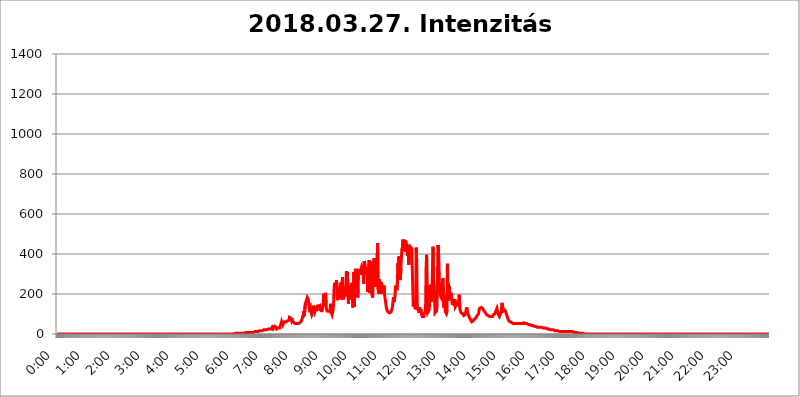
| Category | 2018.03.27. Intenzitás [W/m^2] |
|---|---|
| 0.0 | 0 |
| 0.0006944444444444445 | 0 |
| 0.001388888888888889 | 0 |
| 0.0020833333333333333 | 0 |
| 0.002777777777777778 | 0 |
| 0.003472222222222222 | 0 |
| 0.004166666666666667 | 0 |
| 0.004861111111111111 | 0 |
| 0.005555555555555556 | 0 |
| 0.0062499999999999995 | 0 |
| 0.006944444444444444 | 0 |
| 0.007638888888888889 | 0 |
| 0.008333333333333333 | 0 |
| 0.009027777777777779 | 0 |
| 0.009722222222222222 | 0 |
| 0.010416666666666666 | 0 |
| 0.011111111111111112 | 0 |
| 0.011805555555555555 | 0 |
| 0.012499999999999999 | 0 |
| 0.013194444444444444 | 0 |
| 0.013888888888888888 | 0 |
| 0.014583333333333332 | 0 |
| 0.015277777777777777 | 0 |
| 0.015972222222222224 | 0 |
| 0.016666666666666666 | 0 |
| 0.017361111111111112 | 0 |
| 0.018055555555555557 | 0 |
| 0.01875 | 0 |
| 0.019444444444444445 | 0 |
| 0.02013888888888889 | 0 |
| 0.020833333333333332 | 0 |
| 0.02152777777777778 | 0 |
| 0.022222222222222223 | 0 |
| 0.02291666666666667 | 0 |
| 0.02361111111111111 | 0 |
| 0.024305555555555556 | 0 |
| 0.024999999999999998 | 0 |
| 0.025694444444444447 | 0 |
| 0.02638888888888889 | 0 |
| 0.027083333333333334 | 0 |
| 0.027777777777777776 | 0 |
| 0.02847222222222222 | 0 |
| 0.029166666666666664 | 0 |
| 0.029861111111111113 | 0 |
| 0.030555555555555555 | 0 |
| 0.03125 | 0 |
| 0.03194444444444445 | 0 |
| 0.03263888888888889 | 0 |
| 0.03333333333333333 | 0 |
| 0.034027777777777775 | 0 |
| 0.034722222222222224 | 0 |
| 0.035416666666666666 | 0 |
| 0.036111111111111115 | 0 |
| 0.03680555555555556 | 0 |
| 0.0375 | 0 |
| 0.03819444444444444 | 0 |
| 0.03888888888888889 | 0 |
| 0.03958333333333333 | 0 |
| 0.04027777777777778 | 0 |
| 0.04097222222222222 | 0 |
| 0.041666666666666664 | 0 |
| 0.042361111111111106 | 0 |
| 0.04305555555555556 | 0 |
| 0.043750000000000004 | 0 |
| 0.044444444444444446 | 0 |
| 0.04513888888888889 | 0 |
| 0.04583333333333334 | 0 |
| 0.04652777777777778 | 0 |
| 0.04722222222222222 | 0 |
| 0.04791666666666666 | 0 |
| 0.04861111111111111 | 0 |
| 0.049305555555555554 | 0 |
| 0.049999999999999996 | 0 |
| 0.05069444444444445 | 0 |
| 0.051388888888888894 | 0 |
| 0.052083333333333336 | 0 |
| 0.05277777777777778 | 0 |
| 0.05347222222222222 | 0 |
| 0.05416666666666667 | 0 |
| 0.05486111111111111 | 0 |
| 0.05555555555555555 | 0 |
| 0.05625 | 0 |
| 0.05694444444444444 | 0 |
| 0.057638888888888885 | 0 |
| 0.05833333333333333 | 0 |
| 0.05902777777777778 | 0 |
| 0.059722222222222225 | 0 |
| 0.06041666666666667 | 0 |
| 0.061111111111111116 | 0 |
| 0.06180555555555556 | 0 |
| 0.0625 | 0 |
| 0.06319444444444444 | 0 |
| 0.06388888888888888 | 0 |
| 0.06458333333333334 | 0 |
| 0.06527777777777778 | 0 |
| 0.06597222222222222 | 0 |
| 0.06666666666666667 | 0 |
| 0.06736111111111111 | 0 |
| 0.06805555555555555 | 0 |
| 0.06874999999999999 | 0 |
| 0.06944444444444443 | 0 |
| 0.07013888888888889 | 0 |
| 0.07083333333333333 | 0 |
| 0.07152777777777779 | 0 |
| 0.07222222222222223 | 0 |
| 0.07291666666666667 | 0 |
| 0.07361111111111111 | 0 |
| 0.07430555555555556 | 0 |
| 0.075 | 0 |
| 0.07569444444444444 | 0 |
| 0.0763888888888889 | 0 |
| 0.07708333333333334 | 0 |
| 0.07777777777777778 | 0 |
| 0.07847222222222222 | 0 |
| 0.07916666666666666 | 0 |
| 0.0798611111111111 | 0 |
| 0.08055555555555556 | 0 |
| 0.08125 | 0 |
| 0.08194444444444444 | 0 |
| 0.08263888888888889 | 0 |
| 0.08333333333333333 | 0 |
| 0.08402777777777777 | 0 |
| 0.08472222222222221 | 0 |
| 0.08541666666666665 | 0 |
| 0.08611111111111112 | 0 |
| 0.08680555555555557 | 0 |
| 0.08750000000000001 | 0 |
| 0.08819444444444445 | 0 |
| 0.08888888888888889 | 0 |
| 0.08958333333333333 | 0 |
| 0.09027777777777778 | 0 |
| 0.09097222222222222 | 0 |
| 0.09166666666666667 | 0 |
| 0.09236111111111112 | 0 |
| 0.09305555555555556 | 0 |
| 0.09375 | 0 |
| 0.09444444444444444 | 0 |
| 0.09513888888888888 | 0 |
| 0.09583333333333333 | 0 |
| 0.09652777777777777 | 0 |
| 0.09722222222222222 | 0 |
| 0.09791666666666667 | 0 |
| 0.09861111111111111 | 0 |
| 0.09930555555555555 | 0 |
| 0.09999999999999999 | 0 |
| 0.10069444444444443 | 0 |
| 0.1013888888888889 | 0 |
| 0.10208333333333335 | 0 |
| 0.10277777777777779 | 0 |
| 0.10347222222222223 | 0 |
| 0.10416666666666667 | 0 |
| 0.10486111111111111 | 0 |
| 0.10555555555555556 | 0 |
| 0.10625 | 0 |
| 0.10694444444444444 | 0 |
| 0.1076388888888889 | 0 |
| 0.10833333333333334 | 0 |
| 0.10902777777777778 | 0 |
| 0.10972222222222222 | 0 |
| 0.1111111111111111 | 0 |
| 0.11180555555555556 | 0 |
| 0.11180555555555556 | 0 |
| 0.1125 | 0 |
| 0.11319444444444444 | 0 |
| 0.11388888888888889 | 0 |
| 0.11458333333333333 | 0 |
| 0.11527777777777777 | 0 |
| 0.11597222222222221 | 0 |
| 0.11666666666666665 | 0 |
| 0.1173611111111111 | 0 |
| 0.11805555555555557 | 0 |
| 0.11944444444444445 | 0 |
| 0.12013888888888889 | 0 |
| 0.12083333333333333 | 0 |
| 0.12152777777777778 | 0 |
| 0.12222222222222223 | 0 |
| 0.12291666666666667 | 0 |
| 0.12291666666666667 | 0 |
| 0.12361111111111112 | 0 |
| 0.12430555555555556 | 0 |
| 0.125 | 0 |
| 0.12569444444444444 | 0 |
| 0.12638888888888888 | 0 |
| 0.12708333333333333 | 0 |
| 0.16875 | 0 |
| 0.12847222222222224 | 0 |
| 0.12916666666666668 | 0 |
| 0.12986111111111112 | 0 |
| 0.13055555555555556 | 0 |
| 0.13125 | 0 |
| 0.13194444444444445 | 0 |
| 0.1326388888888889 | 0 |
| 0.13333333333333333 | 0 |
| 0.13402777777777777 | 0 |
| 0.13402777777777777 | 0 |
| 0.13472222222222222 | 0 |
| 0.13541666666666666 | 0 |
| 0.1361111111111111 | 0 |
| 0.13749999999999998 | 0 |
| 0.13819444444444443 | 0 |
| 0.1388888888888889 | 0 |
| 0.13958333333333334 | 0 |
| 0.14027777777777778 | 0 |
| 0.14097222222222222 | 0 |
| 0.14166666666666666 | 0 |
| 0.1423611111111111 | 0 |
| 0.14305555555555557 | 0 |
| 0.14375000000000002 | 0 |
| 0.14444444444444446 | 0 |
| 0.1451388888888889 | 0 |
| 0.1451388888888889 | 0 |
| 0.14652777777777778 | 0 |
| 0.14722222222222223 | 0 |
| 0.14791666666666667 | 0 |
| 0.1486111111111111 | 0 |
| 0.14930555555555555 | 0 |
| 0.15 | 0 |
| 0.15069444444444444 | 0 |
| 0.15138888888888888 | 0 |
| 0.15208333333333332 | 0 |
| 0.15277777777777776 | 0 |
| 0.15347222222222223 | 0 |
| 0.15416666666666667 | 0 |
| 0.15486111111111112 | 0 |
| 0.15555555555555556 | 0 |
| 0.15625 | 0 |
| 0.15694444444444444 | 0 |
| 0.15763888888888888 | 0 |
| 0.15833333333333333 | 0 |
| 0.15902777777777777 | 0 |
| 0.15972222222222224 | 0 |
| 0.16041666666666668 | 0 |
| 0.16111111111111112 | 0 |
| 0.16180555555555556 | 0 |
| 0.1625 | 0 |
| 0.16319444444444445 | 0 |
| 0.1638888888888889 | 0 |
| 0.16458333333333333 | 0 |
| 0.16527777777777777 | 0 |
| 0.16597222222222222 | 0 |
| 0.16666666666666666 | 0 |
| 0.1673611111111111 | 0 |
| 0.16805555555555554 | 0 |
| 0.16874999999999998 | 0 |
| 0.16944444444444443 | 0 |
| 0.17013888888888887 | 0 |
| 0.1708333333333333 | 0 |
| 0.17152777777777775 | 0 |
| 0.17222222222222225 | 0 |
| 0.1729166666666667 | 0 |
| 0.17361111111111113 | 0 |
| 0.17430555555555557 | 0 |
| 0.17500000000000002 | 0 |
| 0.17569444444444446 | 0 |
| 0.1763888888888889 | 0 |
| 0.17708333333333334 | 0 |
| 0.17777777777777778 | 0 |
| 0.17847222222222223 | 0 |
| 0.17916666666666667 | 0 |
| 0.1798611111111111 | 0 |
| 0.18055555555555555 | 0 |
| 0.18125 | 0 |
| 0.18194444444444444 | 0 |
| 0.1826388888888889 | 0 |
| 0.18333333333333335 | 0 |
| 0.1840277777777778 | 0 |
| 0.18472222222222223 | 0 |
| 0.18541666666666667 | 0 |
| 0.18611111111111112 | 0 |
| 0.18680555555555556 | 0 |
| 0.1875 | 0 |
| 0.18819444444444444 | 0 |
| 0.18888888888888888 | 0 |
| 0.18958333333333333 | 0 |
| 0.19027777777777777 | 0 |
| 0.1909722222222222 | 0 |
| 0.19166666666666665 | 0 |
| 0.19236111111111112 | 0 |
| 0.19305555555555554 | 0 |
| 0.19375 | 0 |
| 0.19444444444444445 | 0 |
| 0.1951388888888889 | 0 |
| 0.19583333333333333 | 0 |
| 0.19652777777777777 | 0 |
| 0.19722222222222222 | 0 |
| 0.19791666666666666 | 0 |
| 0.1986111111111111 | 0 |
| 0.19930555555555554 | 0 |
| 0.19999999999999998 | 0 |
| 0.20069444444444443 | 0 |
| 0.20138888888888887 | 0 |
| 0.2020833333333333 | 0 |
| 0.2027777777777778 | 0 |
| 0.2034722222222222 | 0 |
| 0.2041666666666667 | 0 |
| 0.20486111111111113 | 0 |
| 0.20555555555555557 | 0 |
| 0.20625000000000002 | 0 |
| 0.20694444444444446 | 0 |
| 0.2076388888888889 | 0 |
| 0.20833333333333334 | 0 |
| 0.20902777777777778 | 0 |
| 0.20972222222222223 | 0 |
| 0.21041666666666667 | 0 |
| 0.2111111111111111 | 0 |
| 0.21180555555555555 | 0 |
| 0.2125 | 0 |
| 0.21319444444444444 | 0 |
| 0.2138888888888889 | 0 |
| 0.21458333333333335 | 0 |
| 0.2152777777777778 | 0 |
| 0.21597222222222223 | 0 |
| 0.21666666666666667 | 0 |
| 0.21736111111111112 | 0 |
| 0.21805555555555556 | 0 |
| 0.21875 | 0 |
| 0.21944444444444444 | 0 |
| 0.22013888888888888 | 0 |
| 0.22083333333333333 | 0 |
| 0.22152777777777777 | 0 |
| 0.2222222222222222 | 0 |
| 0.22291666666666665 | 0 |
| 0.2236111111111111 | 0 |
| 0.22430555555555556 | 0 |
| 0.225 | 0 |
| 0.22569444444444445 | 0 |
| 0.2263888888888889 | 0 |
| 0.22708333333333333 | 0 |
| 0.22777777777777777 | 0 |
| 0.22847222222222222 | 0 |
| 0.22916666666666666 | 0 |
| 0.2298611111111111 | 0 |
| 0.23055555555555554 | 0 |
| 0.23124999999999998 | 0 |
| 0.23194444444444443 | 0 |
| 0.23263888888888887 | 0 |
| 0.2333333333333333 | 0 |
| 0.2340277777777778 | 0 |
| 0.2347222222222222 | 0 |
| 0.2354166666666667 | 0 |
| 0.23611111111111113 | 0 |
| 0.23680555555555557 | 0 |
| 0.23750000000000002 | 0 |
| 0.23819444444444446 | 0 |
| 0.2388888888888889 | 0 |
| 0.23958333333333334 | 0 |
| 0.24027777777777778 | 0 |
| 0.24097222222222223 | 0 |
| 0.24166666666666667 | 0 |
| 0.2423611111111111 | 0 |
| 0.24305555555555555 | 0 |
| 0.24375 | 0 |
| 0.24444444444444446 | 0 |
| 0.24513888888888888 | 0 |
| 0.24583333333333335 | 0 |
| 0.2465277777777778 | 0 |
| 0.24722222222222223 | 3.525 |
| 0.24791666666666667 | 0 |
| 0.24861111111111112 | 3.525 |
| 0.24930555555555556 | 3.525 |
| 0.25 | 3.525 |
| 0.25069444444444444 | 3.525 |
| 0.2513888888888889 | 3.525 |
| 0.2520833333333333 | 3.525 |
| 0.25277777777777777 | 3.525 |
| 0.2534722222222222 | 3.525 |
| 0.25416666666666665 | 3.525 |
| 0.2548611111111111 | 3.525 |
| 0.2555555555555556 | 3.525 |
| 0.25625000000000003 | 3.525 |
| 0.2569444444444445 | 3.525 |
| 0.2576388888888889 | 3.525 |
| 0.25833333333333336 | 3.525 |
| 0.2590277777777778 | 3.525 |
| 0.25972222222222224 | 3.525 |
| 0.2604166666666667 | 3.525 |
| 0.2611111111111111 | 3.525 |
| 0.26180555555555557 | 3.525 |
| 0.2625 | 3.525 |
| 0.26319444444444445 | 3.525 |
| 0.2638888888888889 | 7.887 |
| 0.26458333333333334 | 7.887 |
| 0.2652777777777778 | 7.887 |
| 0.2659722222222222 | 7.887 |
| 0.26666666666666666 | 7.887 |
| 0.2673611111111111 | 7.887 |
| 0.26805555555555555 | 7.887 |
| 0.26875 | 7.887 |
| 0.26944444444444443 | 7.887 |
| 0.2701388888888889 | 7.887 |
| 0.2708333333333333 | 7.887 |
| 0.27152777777777776 | 7.887 |
| 0.2722222222222222 | 7.887 |
| 0.27291666666666664 | 7.887 |
| 0.2736111111111111 | 7.887 |
| 0.2743055555555555 | 12.257 |
| 0.27499999999999997 | 7.887 |
| 0.27569444444444446 | 12.257 |
| 0.27638888888888885 | 12.257 |
| 0.27708333333333335 | 12.257 |
| 0.2777777777777778 | 12.257 |
| 0.27847222222222223 | 12.257 |
| 0.2791666666666667 | 12.257 |
| 0.2798611111111111 | 12.257 |
| 0.28055555555555556 | 12.257 |
| 0.28125 | 12.257 |
| 0.28194444444444444 | 12.257 |
| 0.2826388888888889 | 16.636 |
| 0.2833333333333333 | 16.636 |
| 0.28402777777777777 | 16.636 |
| 0.2847222222222222 | 16.636 |
| 0.28541666666666665 | 16.636 |
| 0.28611111111111115 | 16.636 |
| 0.28680555555555554 | 16.636 |
| 0.28750000000000003 | 16.636 |
| 0.2881944444444445 | 21.024 |
| 0.2888888888888889 | 21.024 |
| 0.28958333333333336 | 21.024 |
| 0.2902777777777778 | 21.024 |
| 0.29097222222222224 | 21.024 |
| 0.2916666666666667 | 21.024 |
| 0.2923611111111111 | 21.024 |
| 0.29305555555555557 | 21.024 |
| 0.29375 | 21.024 |
| 0.29444444444444445 | 25.419 |
| 0.2951388888888889 | 25.419 |
| 0.29583333333333334 | 25.419 |
| 0.2965277777777778 | 25.419 |
| 0.2972222222222222 | 25.419 |
| 0.29791666666666666 | 25.419 |
| 0.2986111111111111 | 25.419 |
| 0.29930555555555555 | 25.419 |
| 0.3 | 25.419 |
| 0.30069444444444443 | 25.419 |
| 0.3013888888888889 | 34.234 |
| 0.3020833333333333 | 29.823 |
| 0.30277777777777776 | 25.419 |
| 0.3034722222222222 | 25.419 |
| 0.30416666666666664 | 25.419 |
| 0.3048611111111111 | 38.653 |
| 0.3055555555555555 | 34.234 |
| 0.30624999999999997 | 38.653 |
| 0.3069444444444444 | 34.234 |
| 0.3076388888888889 | 25.419 |
| 0.30833333333333335 | 25.419 |
| 0.3090277777777778 | 25.419 |
| 0.30972222222222223 | 29.823 |
| 0.3104166666666667 | 29.823 |
| 0.3111111111111111 | 29.823 |
| 0.31180555555555556 | 29.823 |
| 0.3125 | 34.234 |
| 0.31319444444444444 | 43.079 |
| 0.3138888888888889 | 47.511 |
| 0.3145833333333333 | 60.85 |
| 0.31527777777777777 | 51.951 |
| 0.3159722222222222 | 65.31 |
| 0.31666666666666665 | 47.511 |
| 0.31736111111111115 | 47.511 |
| 0.31805555555555554 | 47.511 |
| 0.31875000000000003 | 60.85 |
| 0.3194444444444445 | 65.31 |
| 0.3201388888888889 | 60.85 |
| 0.32083333333333336 | 60.85 |
| 0.3215277777777778 | 65.31 |
| 0.32222222222222224 | 60.85 |
| 0.3229166666666667 | 65.31 |
| 0.3236111111111111 | 69.775 |
| 0.32430555555555557 | 69.775 |
| 0.325 | 69.775 |
| 0.32569444444444445 | 83.205 |
| 0.3263888888888889 | 83.205 |
| 0.32708333333333334 | 87.692 |
| 0.3277777777777778 | 78.722 |
| 0.3284722222222222 | 69.775 |
| 0.32916666666666666 | 78.722 |
| 0.3298611111111111 | 65.31 |
| 0.33055555555555555 | 60.85 |
| 0.33125 | 60.85 |
| 0.33194444444444443 | 56.398 |
| 0.3326388888888889 | 56.398 |
| 0.3333333333333333 | 51.951 |
| 0.3340277777777778 | 51.951 |
| 0.3347222222222222 | 51.951 |
| 0.3354166666666667 | 51.951 |
| 0.3361111111111111 | 51.951 |
| 0.3368055555555556 | 51.951 |
| 0.33749999999999997 | 51.951 |
| 0.33819444444444446 | 51.951 |
| 0.33888888888888885 | 51.951 |
| 0.33958333333333335 | 51.951 |
| 0.34027777777777773 | 56.398 |
| 0.34097222222222223 | 56.398 |
| 0.3416666666666666 | 60.85 |
| 0.3423611111111111 | 65.31 |
| 0.3430555555555555 | 69.775 |
| 0.34375 | 78.722 |
| 0.3444444444444445 | 92.184 |
| 0.3451388888888889 | 83.205 |
| 0.3458333333333334 | 114.716 |
| 0.34652777777777777 | 92.184 |
| 0.34722222222222227 | 96.682 |
| 0.34791666666666665 | 150.964 |
| 0.34861111111111115 | 155.509 |
| 0.34930555555555554 | 146.423 |
| 0.35000000000000003 | 173.709 |
| 0.3506944444444444 | 182.82 |
| 0.3513888888888889 | 182.82 |
| 0.3520833333333333 | 173.709 |
| 0.3527777777777778 | 146.423 |
| 0.3534722222222222 | 128.284 |
| 0.3541666666666667 | 132.814 |
| 0.3548611111111111 | 137.347 |
| 0.35555555555555557 | 114.716 |
| 0.35625 | 114.716 |
| 0.35694444444444445 | 96.682 |
| 0.3576388888888889 | 96.682 |
| 0.35833333333333334 | 101.184 |
| 0.3590277777777778 | 119.235 |
| 0.3597222222222222 | 141.884 |
| 0.36041666666666666 | 119.235 |
| 0.3611111111111111 | 110.201 |
| 0.36180555555555555 | 119.235 |
| 0.3625 | 137.347 |
| 0.36319444444444443 | 114.716 |
| 0.3638888888888889 | 119.235 |
| 0.3645833333333333 | 128.284 |
| 0.3652777777777778 | 146.423 |
| 0.3659722222222222 | 137.347 |
| 0.3666666666666667 | 141.884 |
| 0.3673611111111111 | 141.884 |
| 0.3680555555555556 | 141.884 |
| 0.36874999999999997 | 114.716 |
| 0.36944444444444446 | 128.284 |
| 0.37013888888888885 | 119.235 |
| 0.37083333333333335 | 110.201 |
| 0.37152777777777773 | 110.201 |
| 0.37222222222222223 | 110.201 |
| 0.3729166666666666 | 146.423 |
| 0.3736111111111111 | 201.058 |
| 0.3743055555555555 | 164.605 |
| 0.375 | 141.884 |
| 0.3756944444444445 | 182.82 |
| 0.3763888888888889 | 205.62 |
| 0.3770833333333334 | 137.347 |
| 0.37777777777777777 | 123.758 |
| 0.37847222222222227 | 114.716 |
| 0.37916666666666665 | 110.201 |
| 0.37986111111111115 | 114.716 |
| 0.38055555555555554 | 114.716 |
| 0.38125000000000003 | 119.235 |
| 0.3819444444444444 | 114.716 |
| 0.3826388888888889 | 110.201 |
| 0.3833333333333333 | 150.964 |
| 0.3840277777777778 | 110.201 |
| 0.3847222222222222 | 105.69 |
| 0.3854166666666667 | 96.682 |
| 0.3861111111111111 | 101.184 |
| 0.38680555555555557 | 119.235 |
| 0.3875 | 146.423 |
| 0.38819444444444445 | 219.309 |
| 0.3888888888888889 | 255.813 |
| 0.38958333333333334 | 260.373 |
| 0.3902777777777778 | 233 |
| 0.3909722222222222 | 242.127 |
| 0.39166666666666666 | 269.49 |
| 0.3923611111111111 | 274.047 |
| 0.39305555555555555 | 169.156 |
| 0.39375 | 201.058 |
| 0.39444444444444443 | 187.378 |
| 0.3951388888888889 | 233 |
| 0.3958333333333333 | 228.436 |
| 0.3965277777777778 | 191.937 |
| 0.3972222222222222 | 255.813 |
| 0.3979166666666667 | 173.709 |
| 0.3986111111111111 | 196.497 |
| 0.3993055555555556 | 173.709 |
| 0.39999999999999997 | 283.156 |
| 0.40069444444444446 | 182.82 |
| 0.40138888888888885 | 173.709 |
| 0.40208333333333335 | 191.937 |
| 0.40277777777777773 | 219.309 |
| 0.40347222222222223 | 210.182 |
| 0.4041666666666666 | 187.378 |
| 0.4048611111111111 | 242.127 |
| 0.4055555555555555 | 314.98 |
| 0.40625 | 260.373 |
| 0.4069444444444445 | 310.44 |
| 0.4076388888888889 | 228.436 |
| 0.4083333333333334 | 150.964 |
| 0.40902777777777777 | 150.964 |
| 0.40972222222222227 | 228.436 |
| 0.41041666666666665 | 242.127 |
| 0.41111111111111115 | 237.564 |
| 0.41180555555555554 | 173.709 |
| 0.41250000000000003 | 191.937 |
| 0.4131944444444444 | 255.813 |
| 0.4138888888888889 | 201.058 |
| 0.4145833333333333 | 132.814 |
| 0.4152777777777778 | 173.709 |
| 0.4159722222222222 | 310.44 |
| 0.4166666666666667 | 137.347 |
| 0.4173611111111111 | 283.156 |
| 0.41805555555555557 | 319.517 |
| 0.41875 | 319.517 |
| 0.41944444444444445 | 324.052 |
| 0.4201388888888889 | 319.517 |
| 0.42083333333333334 | 301.354 |
| 0.4215277777777778 | 182.82 |
| 0.4222222222222222 | 310.44 |
| 0.42291666666666666 | 324.052 |
| 0.4236111111111111 | 305.898 |
| 0.42430555555555555 | 314.98 |
| 0.425 | 296.808 |
| 0.42569444444444443 | 319.517 |
| 0.4263888888888889 | 328.584 |
| 0.4270833333333333 | 337.639 |
| 0.4277777777777778 | 333.113 |
| 0.4284722222222222 | 324.052 |
| 0.4291666666666667 | 324.052 |
| 0.4298611111111111 | 251.251 |
| 0.4305555555555556 | 364.728 |
| 0.43124999999999997 | 355.712 |
| 0.43194444444444446 | 360.221 |
| 0.43263888888888885 | 355.712 |
| 0.43333333333333335 | 301.354 |
| 0.43402777777777773 | 305.898 |
| 0.43472222222222223 | 333.113 |
| 0.4354166666666666 | 210.182 |
| 0.4361111111111111 | 292.259 |
| 0.4368055555555555 | 233 |
| 0.4375 | 369.23 |
| 0.4381944444444445 | 205.62 |
| 0.4388888888888889 | 355.712 |
| 0.4395833333333334 | 233 |
| 0.44027777777777777 | 260.373 |
| 0.44097222222222227 | 201.058 |
| 0.44166666666666665 | 196.497 |
| 0.44236111111111115 | 182.82 |
| 0.44305555555555554 | 364.728 |
| 0.44375000000000003 | 251.251 |
| 0.4444444444444444 | 378.224 |
| 0.4451388888888889 | 364.728 |
| 0.4458333333333333 | 296.808 |
| 0.4465277777777778 | 237.564 |
| 0.4472222222222222 | 274.047 |
| 0.4479166666666667 | 351.198 |
| 0.4486111111111111 | 342.162 |
| 0.44930555555555557 | 453.968 |
| 0.45 | 223.873 |
| 0.45069444444444445 | 219.309 |
| 0.4513888888888889 | 201.058 |
| 0.45208333333333334 | 274.047 |
| 0.4527777777777778 | 201.058 |
| 0.4534722222222222 | 237.564 |
| 0.45416666666666666 | 214.746 |
| 0.4548611111111111 | 260.373 |
| 0.45555555555555555 | 201.058 |
| 0.45625 | 210.182 |
| 0.45694444444444443 | 201.058 |
| 0.4576388888888889 | 214.746 |
| 0.4583333333333333 | 242.127 |
| 0.4590277777777778 | 201.058 |
| 0.4597222222222222 | 178.264 |
| 0.4604166666666667 | 164.605 |
| 0.4611111111111111 | 141.884 |
| 0.4618055555555556 | 128.284 |
| 0.46249999999999997 | 119.235 |
| 0.46319444444444446 | 114.716 |
| 0.46388888888888885 | 110.201 |
| 0.46458333333333335 | 110.201 |
| 0.46527777777777773 | 105.69 |
| 0.46597222222222223 | 105.69 |
| 0.4666666666666666 | 105.69 |
| 0.4673611111111111 | 110.201 |
| 0.4680555555555555 | 110.201 |
| 0.46875 | 114.716 |
| 0.4694444444444445 | 123.758 |
| 0.4701388888888889 | 137.347 |
| 0.4708333333333334 | 141.884 |
| 0.47152777777777777 | 182.82 |
| 0.47222222222222227 | 160.056 |
| 0.47291666666666665 | 173.709 |
| 0.47361111111111115 | 187.378 |
| 0.47430555555555554 | 233 |
| 0.47500000000000003 | 242.127 |
| 0.4756944444444444 | 242.127 |
| 0.4763888888888889 | 219.309 |
| 0.4770833333333333 | 255.813 |
| 0.4777777777777778 | 355.712 |
| 0.4784722222222222 | 305.898 |
| 0.4791666666666667 | 387.202 |
| 0.4798611111111111 | 314.98 |
| 0.48055555555555557 | 373.729 |
| 0.48125 | 269.49 |
| 0.48194444444444445 | 333.113 |
| 0.4826388888888889 | 337.639 |
| 0.48333333333333334 | 422.943 |
| 0.4840277777777778 | 431.833 |
| 0.4847222222222222 | 471.582 |
| 0.48541666666666666 | 471.582 |
| 0.4861111111111111 | 427.39 |
| 0.48680555555555555 | 471.582 |
| 0.4875 | 414.035 |
| 0.48819444444444443 | 449.551 |
| 0.4888888888888889 | 467.187 |
| 0.4895833333333333 | 409.574 |
| 0.4902777777777778 | 449.551 |
| 0.4909722222222222 | 445.129 |
| 0.4916666666666667 | 391.685 |
| 0.4923611111111111 | 427.39 |
| 0.4930555555555556 | 346.682 |
| 0.49374999999999997 | 436.27 |
| 0.49444444444444446 | 422.943 |
| 0.49513888888888885 | 436.27 |
| 0.49583333333333335 | 440.702 |
| 0.49652777777777773 | 431.833 |
| 0.49722222222222223 | 427.39 |
| 0.4979166666666666 | 427.39 |
| 0.4986111111111111 | 422.943 |
| 0.4993055555555555 | 137.347 |
| 0.5 | 132.814 |
| 0.5006944444444444 | 155.509 |
| 0.5013888888888889 | 173.709 |
| 0.5020833333333333 | 123.758 |
| 0.5027777777777778 | 132.814 |
| 0.5034722222222222 | 431.833 |
| 0.5041666666666667 | 360.221 |
| 0.5048611111111111 | 146.423 |
| 0.5055555555555555 | 123.758 |
| 0.50625 | 123.758 |
| 0.5069444444444444 | 114.716 |
| 0.5076388888888889 | 105.69 |
| 0.5083333333333333 | 132.814 |
| 0.5090277777777777 | 105.69 |
| 0.5097222222222222 | 123.758 |
| 0.5104166666666666 | 114.716 |
| 0.5111111111111112 | 96.682 |
| 0.5118055555555555 | 87.692 |
| 0.5125000000000001 | 83.205 |
| 0.5131944444444444 | 83.205 |
| 0.513888888888889 | 87.692 |
| 0.5145833333333333 | 101.184 |
| 0.5152777777777778 | 101.184 |
| 0.5159722222222222 | 114.716 |
| 0.5166666666666667 | 150.964 |
| 0.517361111111111 | 333.113 |
| 0.5180555555555556 | 396.164 |
| 0.5187499999999999 | 128.284 |
| 0.5194444444444445 | 105.69 |
| 0.5201388888888888 | 101.184 |
| 0.5208333333333334 | 105.69 |
| 0.5215277777777778 | 119.235 |
| 0.5222222222222223 | 146.423 |
| 0.5229166666666667 | 246.689 |
| 0.5236111111111111 | 210.182 |
| 0.5243055555555556 | 182.82 |
| 0.525 | 160.056 |
| 0.5256944444444445 | 219.309 |
| 0.5263888888888889 | 337.639 |
| 0.5270833333333333 | 436.27 |
| 0.5277777777777778 | 278.603 |
| 0.5284722222222222 | 223.873 |
| 0.5291666666666667 | 201.058 |
| 0.5298611111111111 | 105.69 |
| 0.5305555555555556 | 101.184 |
| 0.53125 | 101.184 |
| 0.5319444444444444 | 114.716 |
| 0.5326388888888889 | 137.347 |
| 0.5333333333333333 | 301.354 |
| 0.5340277777777778 | 445.129 |
| 0.5347222222222222 | 414.035 |
| 0.5354166666666667 | 342.162 |
| 0.5361111111111111 | 228.436 |
| 0.5368055555555555 | 201.058 |
| 0.5375 | 201.058 |
| 0.5381944444444444 | 187.378 |
| 0.5388888888888889 | 201.058 |
| 0.5395833333333333 | 219.309 |
| 0.5402777777777777 | 214.746 |
| 0.5409722222222222 | 278.603 |
| 0.5416666666666666 | 146.423 |
| 0.5423611111111112 | 132.814 |
| 0.5430555555555555 | 191.937 |
| 0.5437500000000001 | 137.347 |
| 0.5444444444444444 | 110.201 |
| 0.545138888888889 | 105.69 |
| 0.5458333333333333 | 101.184 |
| 0.5465277777777778 | 110.201 |
| 0.5472222222222222 | 351.198 |
| 0.5479166666666667 | 164.605 |
| 0.548611111111111 | 251.251 |
| 0.5493055555555556 | 214.746 |
| 0.5499999999999999 | 237.564 |
| 0.5506944444444445 | 182.82 |
| 0.5513888888888888 | 173.709 |
| 0.5520833333333334 | 205.62 |
| 0.5527777777777778 | 210.182 |
| 0.5534722222222223 | 169.156 |
| 0.5541666666666667 | 146.423 |
| 0.5548611111111111 | 146.423 |
| 0.5555555555555556 | 146.423 |
| 0.55625 | 169.156 |
| 0.5569444444444445 | 141.884 |
| 0.5576388888888889 | 173.709 |
| 0.5583333333333333 | 137.347 |
| 0.5590277777777778 | 141.884 |
| 0.5597222222222222 | 137.347 |
| 0.5604166666666667 | 150.964 |
| 0.5611111111111111 | 146.423 |
| 0.5618055555555556 | 150.964 |
| 0.5625 | 146.423 |
| 0.5631944444444444 | 141.884 |
| 0.5638888888888889 | 196.497 |
| 0.5645833333333333 | 132.814 |
| 0.5652777777777778 | 114.716 |
| 0.5659722222222222 | 110.201 |
| 0.5666666666666667 | 105.69 |
| 0.5673611111111111 | 105.69 |
| 0.5680555555555555 | 110.201 |
| 0.56875 | 101.184 |
| 0.5694444444444444 | 96.682 |
| 0.5701388888888889 | 92.184 |
| 0.5708333333333333 | 96.682 |
| 0.5715277777777777 | 92.184 |
| 0.5722222222222222 | 96.682 |
| 0.5729166666666666 | 101.184 |
| 0.5736111111111112 | 123.758 |
| 0.5743055555555555 | 132.814 |
| 0.5750000000000001 | 119.235 |
| 0.5756944444444444 | 114.716 |
| 0.576388888888889 | 101.184 |
| 0.5770833333333333 | 92.184 |
| 0.5777777777777778 | 83.205 |
| 0.5784722222222222 | 83.205 |
| 0.5791666666666667 | 78.722 |
| 0.579861111111111 | 69.775 |
| 0.5805555555555556 | 65.31 |
| 0.5812499999999999 | 60.85 |
| 0.5819444444444445 | 60.85 |
| 0.5826388888888888 | 60.85 |
| 0.5833333333333334 | 65.31 |
| 0.5840277777777778 | 65.31 |
| 0.5847222222222223 | 74.246 |
| 0.5854166666666667 | 74.246 |
| 0.5861111111111111 | 78.722 |
| 0.5868055555555556 | 78.722 |
| 0.5875 | 83.205 |
| 0.5881944444444445 | 83.205 |
| 0.5888888888888889 | 92.184 |
| 0.5895833333333333 | 96.682 |
| 0.5902777777777778 | 92.184 |
| 0.5909722222222222 | 101.184 |
| 0.5916666666666667 | 119.235 |
| 0.5923611111111111 | 128.284 |
| 0.5930555555555556 | 123.758 |
| 0.59375 | 128.284 |
| 0.5944444444444444 | 132.814 |
| 0.5951388888888889 | 132.814 |
| 0.5958333333333333 | 132.814 |
| 0.5965277777777778 | 128.284 |
| 0.5972222222222222 | 132.814 |
| 0.5979166666666667 | 128.284 |
| 0.5986111111111111 | 114.716 |
| 0.5993055555555555 | 110.201 |
| 0.6 | 110.201 |
| 0.6006944444444444 | 105.69 |
| 0.6013888888888889 | 101.184 |
| 0.6020833333333333 | 96.682 |
| 0.6027777777777777 | 96.682 |
| 0.6034722222222222 | 92.184 |
| 0.6041666666666666 | 92.184 |
| 0.6048611111111112 | 92.184 |
| 0.6055555555555555 | 87.692 |
| 0.6062500000000001 | 87.692 |
| 0.6069444444444444 | 87.692 |
| 0.607638888888889 | 87.692 |
| 0.6083333333333333 | 87.692 |
| 0.6090277777777778 | 83.205 |
| 0.6097222222222222 | 87.692 |
| 0.6104166666666667 | 87.692 |
| 0.611111111111111 | 87.692 |
| 0.6118055555555556 | 96.682 |
| 0.6124999999999999 | 96.682 |
| 0.6131944444444445 | 101.184 |
| 0.6138888888888888 | 101.184 |
| 0.6145833333333334 | 110.201 |
| 0.6152777777777778 | 110.201 |
| 0.6159722222222223 | 114.716 |
| 0.6166666666666667 | 128.284 |
| 0.6173611111111111 | 114.716 |
| 0.6180555555555556 | 105.69 |
| 0.61875 | 96.682 |
| 0.6194444444444445 | 92.184 |
| 0.6201388888888889 | 87.692 |
| 0.6208333333333333 | 92.184 |
| 0.6215277777777778 | 101.184 |
| 0.6222222222222222 | 105.69 |
| 0.6229166666666667 | 114.716 |
| 0.6236111111111111 | 155.509 |
| 0.6243055555555556 | 146.423 |
| 0.625 | 132.814 |
| 0.6256944444444444 | 114.716 |
| 0.6263888888888889 | 119.235 |
| 0.6270833333333333 | 119.235 |
| 0.6277777777777778 | 119.235 |
| 0.6284722222222222 | 114.716 |
| 0.6291666666666667 | 110.201 |
| 0.6298611111111111 | 101.184 |
| 0.6305555555555555 | 92.184 |
| 0.63125 | 87.692 |
| 0.6319444444444444 | 78.722 |
| 0.6326388888888889 | 74.246 |
| 0.6333333333333333 | 65.31 |
| 0.6340277777777777 | 65.31 |
| 0.6347222222222222 | 60.85 |
| 0.6354166666666666 | 60.85 |
| 0.6361111111111112 | 56.398 |
| 0.6368055555555555 | 56.398 |
| 0.6375000000000001 | 56.398 |
| 0.6381944444444444 | 51.951 |
| 0.638888888888889 | 51.951 |
| 0.6395833333333333 | 51.951 |
| 0.6402777777777778 | 51.951 |
| 0.6409722222222222 | 51.951 |
| 0.6416666666666667 | 51.951 |
| 0.642361111111111 | 51.951 |
| 0.6430555555555556 | 51.951 |
| 0.6437499999999999 | 51.951 |
| 0.6444444444444445 | 51.951 |
| 0.6451388888888888 | 51.951 |
| 0.6458333333333334 | 51.951 |
| 0.6465277777777778 | 51.951 |
| 0.6472222222222223 | 51.951 |
| 0.6479166666666667 | 51.951 |
| 0.6486111111111111 | 51.951 |
| 0.6493055555555556 | 51.951 |
| 0.65 | 51.951 |
| 0.6506944444444445 | 51.951 |
| 0.6513888888888889 | 51.951 |
| 0.6520833333333333 | 51.951 |
| 0.6527777777777778 | 56.398 |
| 0.6534722222222222 | 56.398 |
| 0.6541666666666667 | 56.398 |
| 0.6548611111111111 | 56.398 |
| 0.6555555555555556 | 51.951 |
| 0.65625 | 51.951 |
| 0.6569444444444444 | 51.951 |
| 0.6576388888888889 | 51.951 |
| 0.6583333333333333 | 51.951 |
| 0.6590277777777778 | 51.951 |
| 0.6597222222222222 | 51.951 |
| 0.6604166666666667 | 47.511 |
| 0.6611111111111111 | 47.511 |
| 0.6618055555555555 | 47.511 |
| 0.6625 | 47.511 |
| 0.6631944444444444 | 47.511 |
| 0.6638888888888889 | 47.511 |
| 0.6645833333333333 | 43.079 |
| 0.6652777777777777 | 43.079 |
| 0.6659722222222222 | 43.079 |
| 0.6666666666666666 | 43.079 |
| 0.6673611111111111 | 38.653 |
| 0.6680555555555556 | 38.653 |
| 0.6687500000000001 | 38.653 |
| 0.6694444444444444 | 38.653 |
| 0.6701388888888888 | 38.653 |
| 0.6708333333333334 | 38.653 |
| 0.6715277777777778 | 38.653 |
| 0.6722222222222222 | 38.653 |
| 0.6729166666666666 | 34.234 |
| 0.6736111111111112 | 34.234 |
| 0.6743055555555556 | 34.234 |
| 0.6749999999999999 | 34.234 |
| 0.6756944444444444 | 34.234 |
| 0.6763888888888889 | 34.234 |
| 0.6770833333333334 | 34.234 |
| 0.6777777777777777 | 34.234 |
| 0.6784722222222223 | 34.234 |
| 0.6791666666666667 | 34.234 |
| 0.6798611111111111 | 34.234 |
| 0.6805555555555555 | 29.823 |
| 0.68125 | 29.823 |
| 0.6819444444444445 | 29.823 |
| 0.6826388888888889 | 29.823 |
| 0.6833333333333332 | 29.823 |
| 0.6840277777777778 | 29.823 |
| 0.6847222222222222 | 29.823 |
| 0.6854166666666667 | 29.823 |
| 0.686111111111111 | 29.823 |
| 0.6868055555555556 | 29.823 |
| 0.6875 | 25.419 |
| 0.6881944444444444 | 25.419 |
| 0.688888888888889 | 25.419 |
| 0.6895833333333333 | 25.419 |
| 0.6902777777777778 | 25.419 |
| 0.6909722222222222 | 25.419 |
| 0.6916666666666668 | 21.024 |
| 0.6923611111111111 | 21.024 |
| 0.6930555555555555 | 21.024 |
| 0.69375 | 21.024 |
| 0.6944444444444445 | 21.024 |
| 0.6951388888888889 | 21.024 |
| 0.6958333333333333 | 21.024 |
| 0.6965277777777777 | 21.024 |
| 0.6972222222222223 | 21.024 |
| 0.6979166666666666 | 16.636 |
| 0.6986111111111111 | 16.636 |
| 0.6993055555555556 | 16.636 |
| 0.7000000000000001 | 16.636 |
| 0.7006944444444444 | 16.636 |
| 0.7013888888888888 | 16.636 |
| 0.7020833333333334 | 16.636 |
| 0.7027777777777778 | 16.636 |
| 0.7034722222222222 | 12.257 |
| 0.7041666666666666 | 12.257 |
| 0.7048611111111112 | 12.257 |
| 0.7055555555555556 | 12.257 |
| 0.7062499999999999 | 12.257 |
| 0.7069444444444444 | 12.257 |
| 0.7076388888888889 | 12.257 |
| 0.7083333333333334 | 12.257 |
| 0.7090277777777777 | 12.257 |
| 0.7097222222222223 | 12.257 |
| 0.7104166666666667 | 12.257 |
| 0.7111111111111111 | 12.257 |
| 0.7118055555555555 | 12.257 |
| 0.7125 | 12.257 |
| 0.7131944444444445 | 12.257 |
| 0.7138888888888889 | 12.257 |
| 0.7145833333333332 | 12.257 |
| 0.7152777777777778 | 12.257 |
| 0.7159722222222222 | 12.257 |
| 0.7166666666666667 | 12.257 |
| 0.717361111111111 | 12.257 |
| 0.7180555555555556 | 12.257 |
| 0.71875 | 12.257 |
| 0.7194444444444444 | 7.887 |
| 0.720138888888889 | 12.257 |
| 0.7208333333333333 | 12.257 |
| 0.7215277777777778 | 12.257 |
| 0.7222222222222222 | 7.887 |
| 0.7229166666666668 | 12.257 |
| 0.7236111111111111 | 7.887 |
| 0.7243055555555555 | 7.887 |
| 0.725 | 7.887 |
| 0.7256944444444445 | 7.887 |
| 0.7263888888888889 | 7.887 |
| 0.7270833333333333 | 7.887 |
| 0.7277777777777777 | 7.887 |
| 0.7284722222222223 | 7.887 |
| 0.7291666666666666 | 7.887 |
| 0.7298611111111111 | 7.887 |
| 0.7305555555555556 | 3.525 |
| 0.7312500000000001 | 3.525 |
| 0.7319444444444444 | 3.525 |
| 0.7326388888888888 | 3.525 |
| 0.7333333333333334 | 3.525 |
| 0.7340277777777778 | 3.525 |
| 0.7347222222222222 | 3.525 |
| 0.7354166666666666 | 3.525 |
| 0.7361111111111112 | 3.525 |
| 0.7368055555555556 | 3.525 |
| 0.7374999999999999 | 3.525 |
| 0.7381944444444444 | 0 |
| 0.7388888888888889 | 0 |
| 0.7395833333333334 | 0 |
| 0.7402777777777777 | 0 |
| 0.7409722222222223 | 0 |
| 0.7416666666666667 | 0 |
| 0.7423611111111111 | 0 |
| 0.7430555555555555 | 0 |
| 0.74375 | 0 |
| 0.7444444444444445 | 0 |
| 0.7451388888888889 | 0 |
| 0.7458333333333332 | 0 |
| 0.7465277777777778 | 0 |
| 0.7472222222222222 | 0 |
| 0.7479166666666667 | 0 |
| 0.748611111111111 | 0 |
| 0.7493055555555556 | 0 |
| 0.75 | 0 |
| 0.7506944444444444 | 0 |
| 0.751388888888889 | 0 |
| 0.7520833333333333 | 0 |
| 0.7527777777777778 | 0 |
| 0.7534722222222222 | 0 |
| 0.7541666666666668 | 0 |
| 0.7548611111111111 | 0 |
| 0.7555555555555555 | 0 |
| 0.75625 | 0 |
| 0.7569444444444445 | 0 |
| 0.7576388888888889 | 0 |
| 0.7583333333333333 | 0 |
| 0.7590277777777777 | 0 |
| 0.7597222222222223 | 0 |
| 0.7604166666666666 | 0 |
| 0.7611111111111111 | 0 |
| 0.7618055555555556 | 0 |
| 0.7625000000000001 | 0 |
| 0.7631944444444444 | 0 |
| 0.7638888888888888 | 0 |
| 0.7645833333333334 | 0 |
| 0.7652777777777778 | 0 |
| 0.7659722222222222 | 0 |
| 0.7666666666666666 | 0 |
| 0.7673611111111112 | 0 |
| 0.7680555555555556 | 0 |
| 0.7687499999999999 | 0 |
| 0.7694444444444444 | 0 |
| 0.7701388888888889 | 0 |
| 0.7708333333333334 | 0 |
| 0.7715277777777777 | 0 |
| 0.7722222222222223 | 0 |
| 0.7729166666666667 | 0 |
| 0.7736111111111111 | 0 |
| 0.7743055555555555 | 0 |
| 0.775 | 0 |
| 0.7756944444444445 | 0 |
| 0.7763888888888889 | 0 |
| 0.7770833333333332 | 0 |
| 0.7777777777777778 | 0 |
| 0.7784722222222222 | 0 |
| 0.7791666666666667 | 0 |
| 0.779861111111111 | 0 |
| 0.7805555555555556 | 0 |
| 0.78125 | 0 |
| 0.7819444444444444 | 0 |
| 0.782638888888889 | 0 |
| 0.7833333333333333 | 0 |
| 0.7840277777777778 | 0 |
| 0.7847222222222222 | 0 |
| 0.7854166666666668 | 0 |
| 0.7861111111111111 | 0 |
| 0.7868055555555555 | 0 |
| 0.7875 | 0 |
| 0.7881944444444445 | 0 |
| 0.7888888888888889 | 0 |
| 0.7895833333333333 | 0 |
| 0.7902777777777777 | 0 |
| 0.7909722222222223 | 0 |
| 0.7916666666666666 | 0 |
| 0.7923611111111111 | 0 |
| 0.7930555555555556 | 0 |
| 0.7937500000000001 | 0 |
| 0.7944444444444444 | 0 |
| 0.7951388888888888 | 0 |
| 0.7958333333333334 | 0 |
| 0.7965277777777778 | 0 |
| 0.7972222222222222 | 0 |
| 0.7979166666666666 | 0 |
| 0.7986111111111112 | 0 |
| 0.7993055555555556 | 0 |
| 0.7999999999999999 | 0 |
| 0.8006944444444444 | 0 |
| 0.8013888888888889 | 0 |
| 0.8020833333333334 | 0 |
| 0.8027777777777777 | 0 |
| 0.8034722222222223 | 0 |
| 0.8041666666666667 | 0 |
| 0.8048611111111111 | 0 |
| 0.8055555555555555 | 0 |
| 0.80625 | 0 |
| 0.8069444444444445 | 0 |
| 0.8076388888888889 | 0 |
| 0.8083333333333332 | 0 |
| 0.8090277777777778 | 0 |
| 0.8097222222222222 | 0 |
| 0.8104166666666667 | 0 |
| 0.811111111111111 | 0 |
| 0.8118055555555556 | 0 |
| 0.8125 | 0 |
| 0.8131944444444444 | 0 |
| 0.813888888888889 | 0 |
| 0.8145833333333333 | 0 |
| 0.8152777777777778 | 0 |
| 0.8159722222222222 | 0 |
| 0.8166666666666668 | 0 |
| 0.8173611111111111 | 0 |
| 0.8180555555555555 | 0 |
| 0.81875 | 0 |
| 0.8194444444444445 | 0 |
| 0.8201388888888889 | 0 |
| 0.8208333333333333 | 0 |
| 0.8215277777777777 | 0 |
| 0.8222222222222223 | 0 |
| 0.8229166666666666 | 0 |
| 0.8236111111111111 | 0 |
| 0.8243055555555556 | 0 |
| 0.8250000000000001 | 0 |
| 0.8256944444444444 | 0 |
| 0.8263888888888888 | 0 |
| 0.8270833333333334 | 0 |
| 0.8277777777777778 | 0 |
| 0.8284722222222222 | 0 |
| 0.8291666666666666 | 0 |
| 0.8298611111111112 | 0 |
| 0.8305555555555556 | 0 |
| 0.8312499999999999 | 0 |
| 0.8319444444444444 | 0 |
| 0.8326388888888889 | 0 |
| 0.8333333333333334 | 0 |
| 0.8340277777777777 | 0 |
| 0.8347222222222223 | 0 |
| 0.8354166666666667 | 0 |
| 0.8361111111111111 | 0 |
| 0.8368055555555555 | 0 |
| 0.8375 | 0 |
| 0.8381944444444445 | 0 |
| 0.8388888888888889 | 0 |
| 0.8395833333333332 | 0 |
| 0.8402777777777778 | 0 |
| 0.8409722222222222 | 0 |
| 0.8416666666666667 | 0 |
| 0.842361111111111 | 0 |
| 0.8430555555555556 | 0 |
| 0.84375 | 0 |
| 0.8444444444444444 | 0 |
| 0.845138888888889 | 0 |
| 0.8458333333333333 | 0 |
| 0.8465277777777778 | 0 |
| 0.8472222222222222 | 0 |
| 0.8479166666666668 | 0 |
| 0.8486111111111111 | 0 |
| 0.8493055555555555 | 0 |
| 0.85 | 0 |
| 0.8506944444444445 | 0 |
| 0.8513888888888889 | 0 |
| 0.8520833333333333 | 0 |
| 0.8527777777777777 | 0 |
| 0.8534722222222223 | 0 |
| 0.8541666666666666 | 0 |
| 0.8548611111111111 | 0 |
| 0.8555555555555556 | 0 |
| 0.8562500000000001 | 0 |
| 0.8569444444444444 | 0 |
| 0.8576388888888888 | 0 |
| 0.8583333333333334 | 0 |
| 0.8590277777777778 | 0 |
| 0.8597222222222222 | 0 |
| 0.8604166666666666 | 0 |
| 0.8611111111111112 | 0 |
| 0.8618055555555556 | 0 |
| 0.8624999999999999 | 0 |
| 0.8631944444444444 | 0 |
| 0.8638888888888889 | 0 |
| 0.8645833333333334 | 0 |
| 0.8652777777777777 | 0 |
| 0.8659722222222223 | 0 |
| 0.8666666666666667 | 0 |
| 0.8673611111111111 | 0 |
| 0.8680555555555555 | 0 |
| 0.86875 | 0 |
| 0.8694444444444445 | 0 |
| 0.8701388888888889 | 0 |
| 0.8708333333333332 | 0 |
| 0.8715277777777778 | 0 |
| 0.8722222222222222 | 0 |
| 0.8729166666666667 | 0 |
| 0.873611111111111 | 0 |
| 0.8743055555555556 | 0 |
| 0.875 | 0 |
| 0.8756944444444444 | 0 |
| 0.876388888888889 | 0 |
| 0.8770833333333333 | 0 |
| 0.8777777777777778 | 0 |
| 0.8784722222222222 | 0 |
| 0.8791666666666668 | 0 |
| 0.8798611111111111 | 0 |
| 0.8805555555555555 | 0 |
| 0.88125 | 0 |
| 0.8819444444444445 | 0 |
| 0.8826388888888889 | 0 |
| 0.8833333333333333 | 0 |
| 0.8840277777777777 | 0 |
| 0.8847222222222223 | 0 |
| 0.8854166666666666 | 0 |
| 0.8861111111111111 | 0 |
| 0.8868055555555556 | 0 |
| 0.8875000000000001 | 0 |
| 0.8881944444444444 | 0 |
| 0.8888888888888888 | 0 |
| 0.8895833333333334 | 0 |
| 0.8902777777777778 | 0 |
| 0.8909722222222222 | 0 |
| 0.8916666666666666 | 0 |
| 0.8923611111111112 | 0 |
| 0.8930555555555556 | 0 |
| 0.8937499999999999 | 0 |
| 0.8944444444444444 | 0 |
| 0.8951388888888889 | 0 |
| 0.8958333333333334 | 0 |
| 0.8965277777777777 | 0 |
| 0.8972222222222223 | 0 |
| 0.8979166666666667 | 0 |
| 0.8986111111111111 | 0 |
| 0.8993055555555555 | 0 |
| 0.9 | 0 |
| 0.9006944444444445 | 0 |
| 0.9013888888888889 | 0 |
| 0.9020833333333332 | 0 |
| 0.9027777777777778 | 0 |
| 0.9034722222222222 | 0 |
| 0.9041666666666667 | 0 |
| 0.904861111111111 | 0 |
| 0.9055555555555556 | 0 |
| 0.90625 | 0 |
| 0.9069444444444444 | 0 |
| 0.907638888888889 | 0 |
| 0.9083333333333333 | 0 |
| 0.9090277777777778 | 0 |
| 0.9097222222222222 | 0 |
| 0.9104166666666668 | 0 |
| 0.9111111111111111 | 0 |
| 0.9118055555555555 | 0 |
| 0.9125 | 0 |
| 0.9131944444444445 | 0 |
| 0.9138888888888889 | 0 |
| 0.9145833333333333 | 0 |
| 0.9152777777777777 | 0 |
| 0.9159722222222223 | 0 |
| 0.9166666666666666 | 0 |
| 0.9173611111111111 | 0 |
| 0.9180555555555556 | 0 |
| 0.9187500000000001 | 0 |
| 0.9194444444444444 | 0 |
| 0.9201388888888888 | 0 |
| 0.9208333333333334 | 0 |
| 0.9215277777777778 | 0 |
| 0.9222222222222222 | 0 |
| 0.9229166666666666 | 0 |
| 0.9236111111111112 | 0 |
| 0.9243055555555556 | 0 |
| 0.9249999999999999 | 0 |
| 0.9256944444444444 | 0 |
| 0.9263888888888889 | 0 |
| 0.9270833333333334 | 0 |
| 0.9277777777777777 | 0 |
| 0.9284722222222223 | 0 |
| 0.9291666666666667 | 0 |
| 0.9298611111111111 | 0 |
| 0.9305555555555555 | 0 |
| 0.93125 | 0 |
| 0.9319444444444445 | 0 |
| 0.9326388888888889 | 0 |
| 0.9333333333333332 | 0 |
| 0.9340277777777778 | 0 |
| 0.9347222222222222 | 0 |
| 0.9354166666666667 | 0 |
| 0.936111111111111 | 0 |
| 0.9368055555555556 | 0 |
| 0.9375 | 0 |
| 0.9381944444444444 | 0 |
| 0.938888888888889 | 0 |
| 0.9395833333333333 | 0 |
| 0.9402777777777778 | 0 |
| 0.9409722222222222 | 0 |
| 0.9416666666666668 | 0 |
| 0.9423611111111111 | 0 |
| 0.9430555555555555 | 0 |
| 0.94375 | 0 |
| 0.9444444444444445 | 0 |
| 0.9451388888888889 | 0 |
| 0.9458333333333333 | 0 |
| 0.9465277777777777 | 0 |
| 0.9472222222222223 | 0 |
| 0.9479166666666666 | 0 |
| 0.9486111111111111 | 0 |
| 0.9493055555555556 | 0 |
| 0.9500000000000001 | 0 |
| 0.9506944444444444 | 0 |
| 0.9513888888888888 | 0 |
| 0.9520833333333334 | 0 |
| 0.9527777777777778 | 0 |
| 0.9534722222222222 | 0 |
| 0.9541666666666666 | 0 |
| 0.9548611111111112 | 0 |
| 0.9555555555555556 | 0 |
| 0.9562499999999999 | 0 |
| 0.9569444444444444 | 0 |
| 0.9576388888888889 | 0 |
| 0.9583333333333334 | 0 |
| 0.9590277777777777 | 0 |
| 0.9597222222222223 | 0 |
| 0.9604166666666667 | 0 |
| 0.9611111111111111 | 0 |
| 0.9618055555555555 | 0 |
| 0.9625 | 0 |
| 0.9631944444444445 | 0 |
| 0.9638888888888889 | 0 |
| 0.9645833333333332 | 0 |
| 0.9652777777777778 | 0 |
| 0.9659722222222222 | 0 |
| 0.9666666666666667 | 0 |
| 0.967361111111111 | 0 |
| 0.9680555555555556 | 0 |
| 0.96875 | 0 |
| 0.9694444444444444 | 0 |
| 0.970138888888889 | 0 |
| 0.9708333333333333 | 0 |
| 0.9715277777777778 | 0 |
| 0.9722222222222222 | 0 |
| 0.9729166666666668 | 0 |
| 0.9736111111111111 | 0 |
| 0.9743055555555555 | 0 |
| 0.975 | 0 |
| 0.9756944444444445 | 0 |
| 0.9763888888888889 | 0 |
| 0.9770833333333333 | 0 |
| 0.9777777777777777 | 0 |
| 0.9784722222222223 | 0 |
| 0.9791666666666666 | 0 |
| 0.9798611111111111 | 0 |
| 0.9805555555555556 | 0 |
| 0.9812500000000001 | 0 |
| 0.9819444444444444 | 0 |
| 0.9826388888888888 | 0 |
| 0.9833333333333334 | 0 |
| 0.9840277777777778 | 0 |
| 0.9847222222222222 | 0 |
| 0.9854166666666666 | 0 |
| 0.9861111111111112 | 0 |
| 0.9868055555555556 | 0 |
| 0.9874999999999999 | 0 |
| 0.9881944444444444 | 0 |
| 0.9888888888888889 | 0 |
| 0.9895833333333334 | 0 |
| 0.9902777777777777 | 0 |
| 0.9909722222222223 | 0 |
| 0.9916666666666667 | 0 |
| 0.9923611111111111 | 0 |
| 0.9930555555555555 | 0 |
| 0.99375 | 0 |
| 0.9944444444444445 | 0 |
| 0.9951388888888889 | 0 |
| 0.9958333333333332 | 0 |
| 0.9965277777777778 | 0 |
| 0.9972222222222222 | 0 |
| 0.9979166666666667 | 0 |
| 0.998611111111111 | 0 |
| 0.9993055555555556 | 0 |